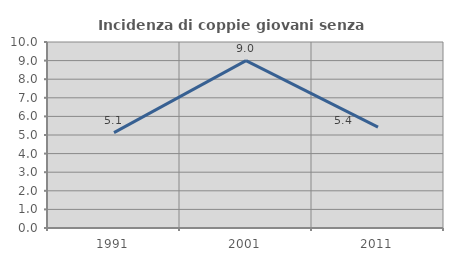
| Category | Incidenza di coppie giovani senza figli |
|---|---|
| 1991.0 | 5.128 |
| 2001.0 | 8.996 |
| 2011.0 | 5.427 |